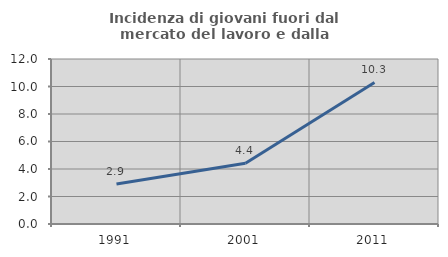
| Category | Incidenza di giovani fuori dal mercato del lavoro e dalla formazione  |
|---|---|
| 1991.0 | 2.913 |
| 2001.0 | 4.412 |
| 2011.0 | 10.294 |